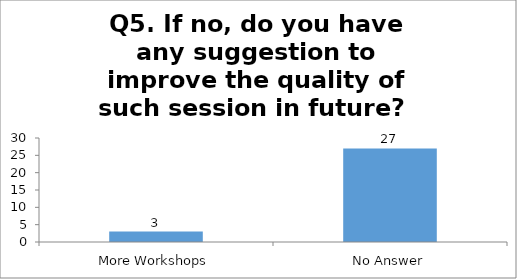
| Category | Q5. If no, do you have any suggestion to improve the quality of such session in future?  |
|---|---|
| More Workshops | 3 |
| No Answer | 27 |